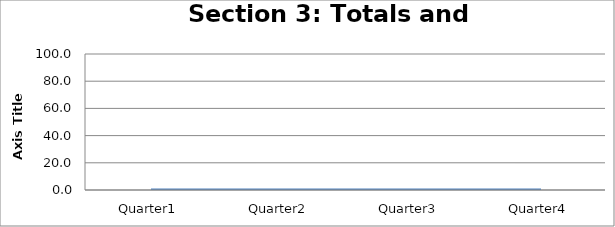
| Category | Section 3: Totals and Compliance |
|---|---|
| Quarter1 | 0 |
| Quarter2 | 0 |
| Quarter3 | 0 |
| Quarter4 | 0 |